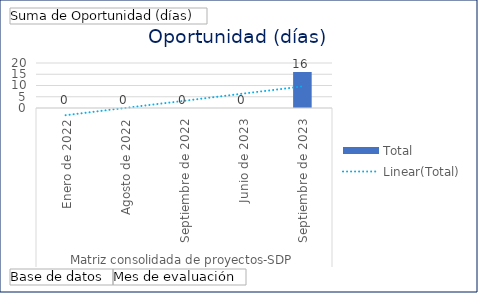
| Category | Total |
|---|---|
| 0 | 0 |
| 1 | 0 |
| 2 | 0 |
| 3 | 0 |
| 4 | 16 |